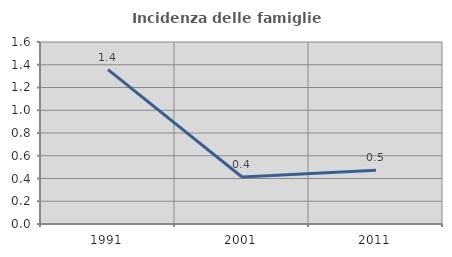
| Category | Incidenza delle famiglie numerose |
|---|---|
| 1991.0 | 1.358 |
| 2001.0 | 0.413 |
| 2011.0 | 0.473 |